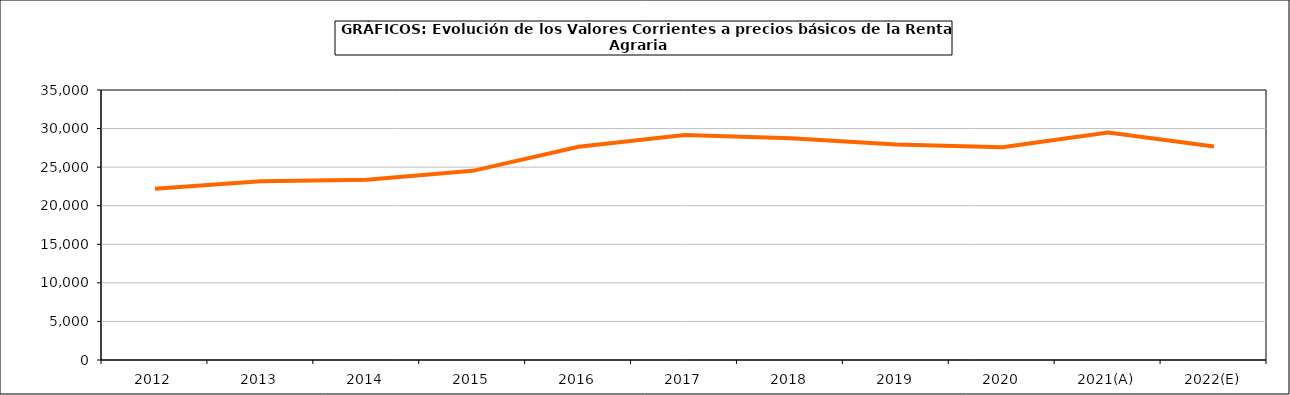
| Category | renta agraria |
|---|---|
| 2012 | 22193.5 |
| 2013 | 23161.5 |
| 2014 | 23361.1 |
| 2015 | 24518.8 |
| 2016 | 27646.8 |
| 2017 | 29152.2 |
| 2018 | 28755.3 |
| 2019 | 27946.4 |
| 2020 | 27565.1 |
| 2021(A) | 29492.3 |
| 2022(E) | 27663.6 |